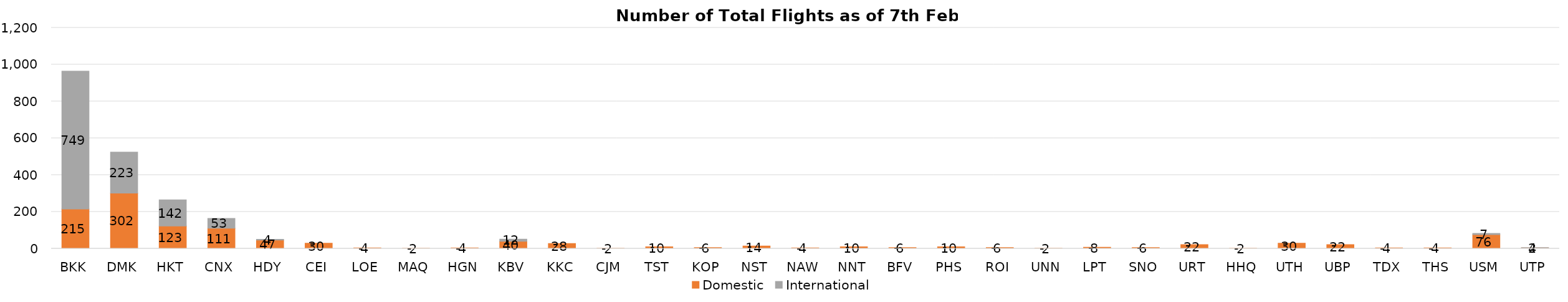
| Category | Domestic | International |
|---|---|---|
| BKK | 215 | 749 |
| DMK | 302 | 223 |
| HKT | 123 | 142 |
| CNX | 111 | 53 |
| HDY | 47 | 4 |
| CEI | 30 | 0 |
| LOE | 4 | 0 |
| MAQ | 2 | 0 |
| HGN | 4 | 0 |
| KBV | 40 | 12 |
| KKC | 28 | 0 |
| CJM | 2 | 0 |
| TST | 10 | 0 |
| KOP | 6 | 0 |
| NST | 14 | 0 |
| NAW | 4 | 0 |
| NNT | 10 | 0 |
| BFV | 6 | 0 |
| PHS | 10 | 0 |
| ROI | 6 | 0 |
| UNN | 2 | 0 |
| LPT | 8 | 0 |
| SNO | 6 | 0 |
| URT | 22 | 0 |
| HHQ | 2 | 0 |
| UTH | 30 | 0 |
| UBP | 22 | 0 |
| TDX | 4 | 0 |
| THS | 4 | 0 |
| USM | 76 | 7 |
| UTP | 4 | 2 |